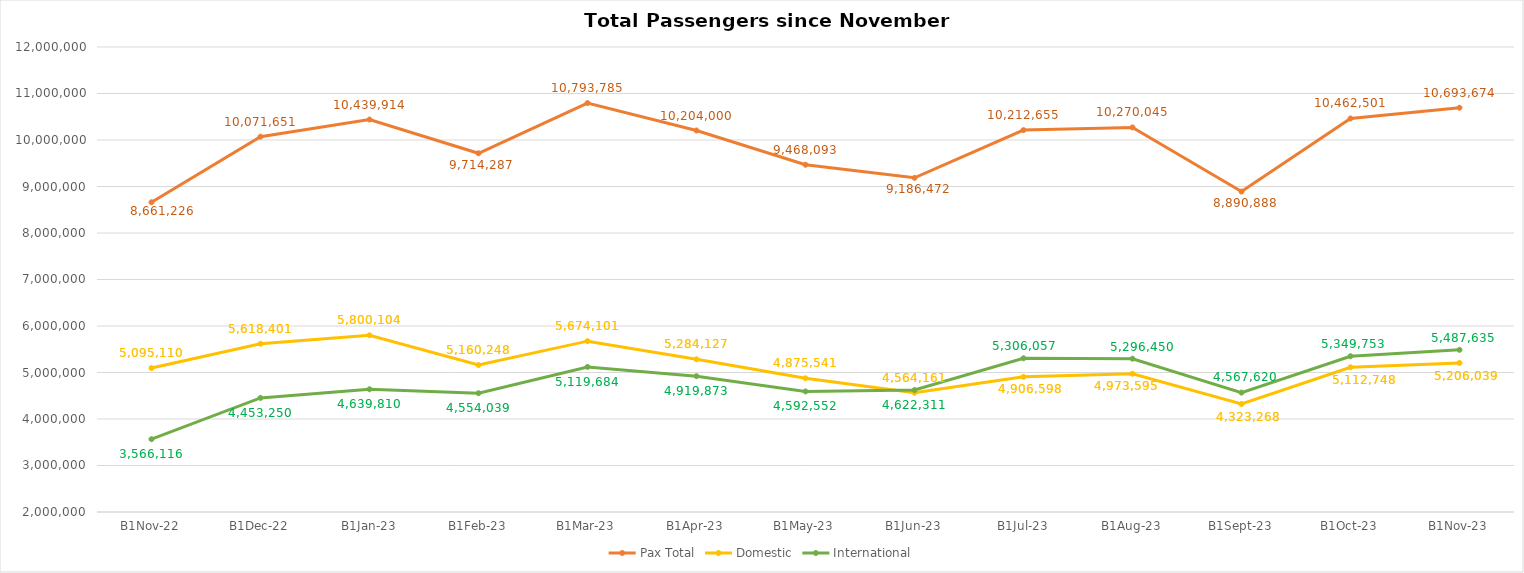
| Category | Pax Total |  Domestic  |  International  |
|---|---|---|---|
| 2022-11-01 | 8661226 | 5095110 | 3566116 |
| 2022-12-01 | 10071651 | 5618401 | 4453250 |
| 2023-01-01 | 10439914 | 5800104 | 4639810 |
| 2023-02-01 | 9714287 | 5160248 | 4554039 |
| 2023-03-01 | 10793785 | 5674101 | 5119684 |
| 2023-04-01 | 10204000 | 5284127 | 4919873 |
| 2023-05-01 | 9468093 | 4875541 | 4592552 |
| 2023-06-01 | 9186472 | 4564161 | 4622311 |
| 2023-07-01 | 10212655 | 4906598 | 5306057 |
| 2023-08-01 | 10270045 | 4973595 | 5296450 |
| 2023-09-01 | 8890888 | 4323268 | 4567620 |
| 2023-10-01 | 10462501 | 5112748 | 5349753 |
| 2023-11-01 | 10693674 | 5206039 | 5487635 |